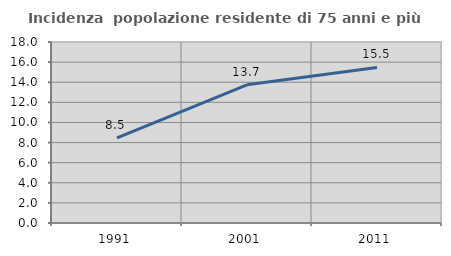
| Category | Incidenza  popolazione residente di 75 anni e più |
|---|---|
| 1991.0 | 8.468 |
| 2001.0 | 13.744 |
| 2011.0 | 15.474 |